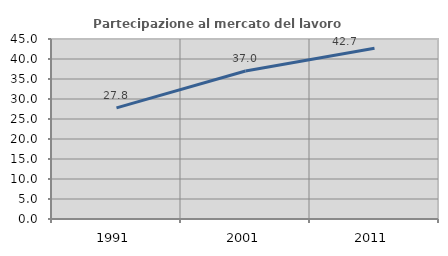
| Category | Partecipazione al mercato del lavoro  femminile |
|---|---|
| 1991.0 | 27.778 |
| 2001.0 | 37.013 |
| 2011.0 | 42.667 |